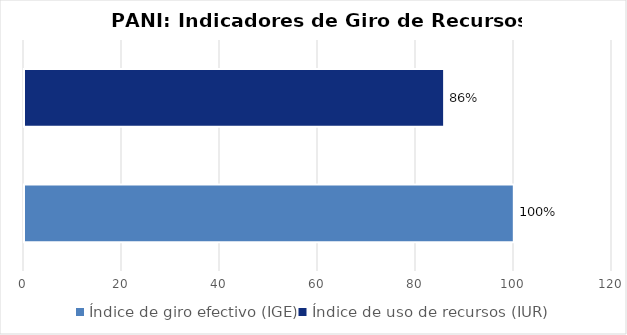
| Category | Total programa |
|---|---|
| Índice de giro efectivo (IGE) | 99.961 |
| Índice de uso de recursos (IUR)  | 85.739 |